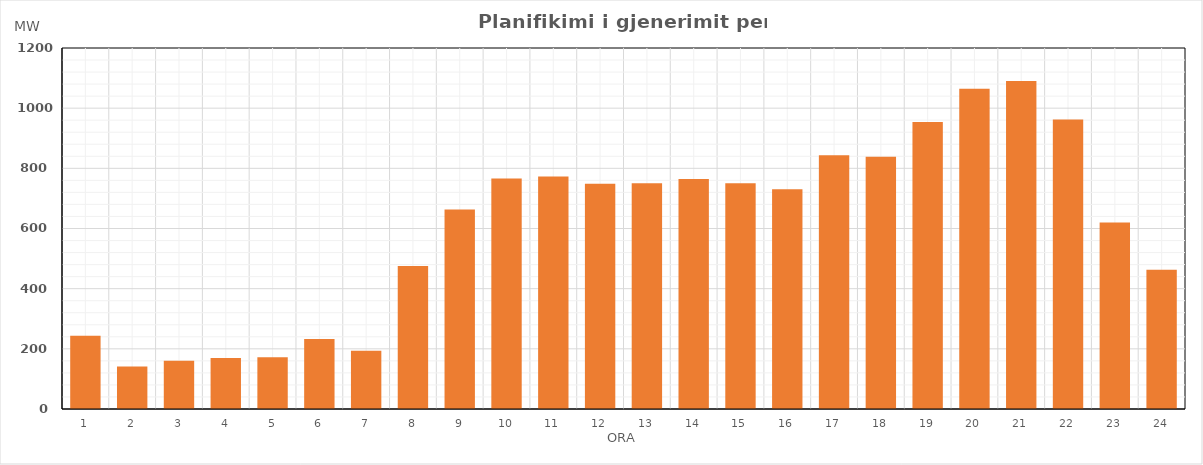
| Category | Max (MW) |
|---|---|
| 0 | 243.694 |
| 1 | 141.149 |
| 2 | 160.204 |
| 3 | 169.239 |
| 4 | 172.249 |
| 5 | 232.353 |
| 6 | 193.933 |
| 7 | 475.229 |
| 8 | 663.239 |
| 9 | 765.81 |
| 10 | 772.81 |
| 11 | 748.809 |
| 12 | 750.804 |
| 13 | 764.839 |
| 14 | 750.824 |
| 15 | 730.679 |
| 16 | 843.299 |
| 17 | 838.194 |
| 18 | 954.389 |
| 19 | 1064.539 |
| 20 | 1090.464 |
| 21 | 962.254 |
| 22 | 620.32 |
| 23 | 462.574 |